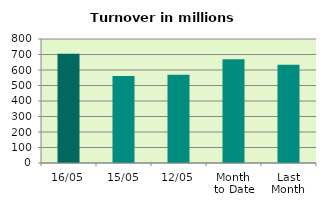
| Category | Series 0 |
|---|---|
| 16/05 | 705.168 |
| 15/05 | 561.443 |
| 12/05 | 570.051 |
| Month 
to Date | 670.057 |
| Last
Month | 634.312 |